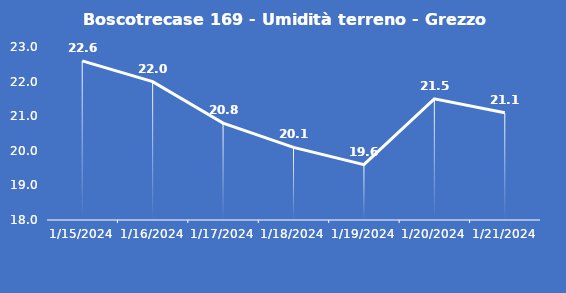
| Category | Boscotrecase 169 - Umidità terreno - Grezzo (%VWC) |
|---|---|
| 1/15/24 | 22.6 |
| 1/16/24 | 22 |
| 1/17/24 | 20.8 |
| 1/18/24 | 20.1 |
| 1/19/24 | 19.6 |
| 1/20/24 | 21.5 |
| 1/21/24 | 21.1 |